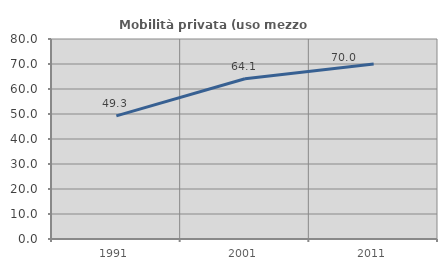
| Category | Mobilità privata (uso mezzo privato) |
|---|---|
| 1991.0 | 49.265 |
| 2001.0 | 64.095 |
| 2011.0 | 69.966 |